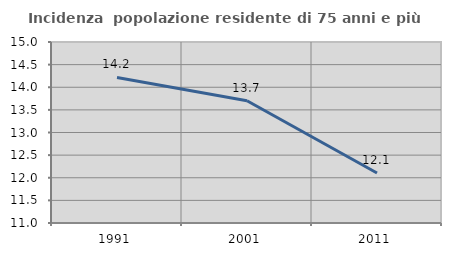
| Category | Incidenza  popolazione residente di 75 anni e più |
|---|---|
| 1991.0 | 14.216 |
| 2001.0 | 13.702 |
| 2011.0 | 12.104 |